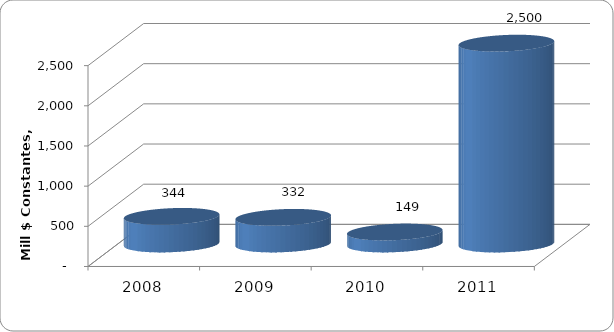
| Category | SALDO DE DEUDA |
|---|---|
| 2008.0 | 343.85 |
| 2009.0 | 331.757 |
| 2010.0 | 149.371 |
| 2011.0 | 2500 |